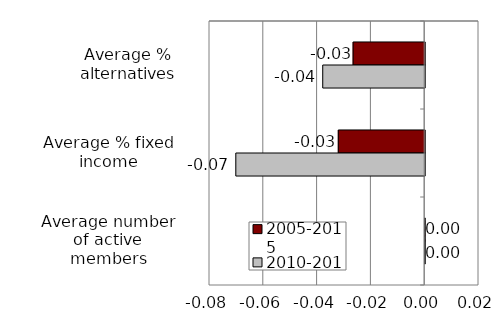
| Category | 2005-2015 | 2010-2015 |
|---|---|---|
| Average % alternatives | -0.027 | -0.038 |
| Average % fixed income | -0.032 | -0.07 |
| Average number of active members | 0 | 0 |